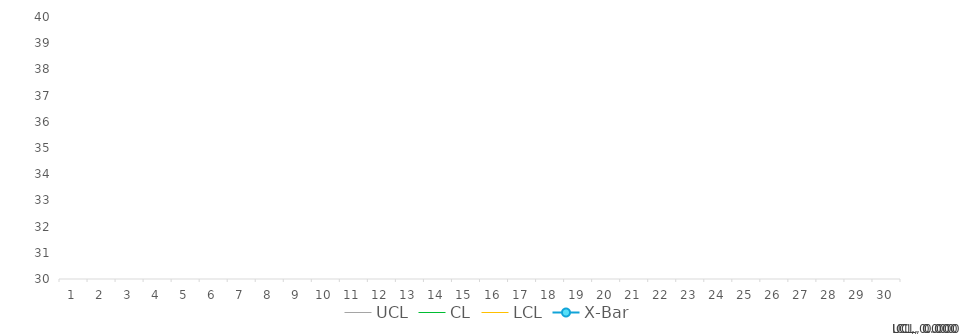
| Category | UCL | CL | LCL | X-Bar |
|---|---|---|---|---|
| 1.0 | 0 | 0 | 0 |  |
| 2.0 | 0 | 0 | 0 |  |
| 3.0 | 0 | 0 | 0 |  |
| 4.0 | 0 | 0 | 0 |  |
| 5.0 | 0 | 0 | 0 |  |
| 6.0 | 0 | 0 | 0 |  |
| 7.0 | 0 | 0 | 0 |  |
| 8.0 | 0 | 0 | 0 |  |
| 9.0 | 0 | 0 | 0 |  |
| 10.0 | 0 | 0 | 0 |  |
| 11.0 | 0 | 0 | 0 |  |
| 12.0 | 0 | 0 | 0 |  |
| 13.0 | 0 | 0 | 0 |  |
| 14.0 | 0 | 0 | 0 |  |
| 15.0 | 0 | 0 | 0 |  |
| 16.0 | 0 | 0 | 0 |  |
| 17.0 | 0 | 0 | 0 |  |
| 18.0 | 0 | 0 | 0 |  |
| 19.0 | 0 | 0 | 0 |  |
| 20.0 | 0 | 0 | 0 |  |
| 21.0 | 0 | 0 | 0 |  |
| 22.0 | 0 | 0 | 0 |  |
| 23.0 | 0 | 0 | 0 |  |
| 24.0 | 0 | 0 | 0 |  |
| 25.0 | 0 | 0 | 0 |  |
| 26.0 | 0 | 0 | 0 |  |
| 27.0 | 0 | 0 | 0 |  |
| 28.0 | 0 | 0 | 0 |  |
| 29.0 | 0 | 0 | 0 |  |
| 30.0 | 0 | 0 | 0 |  |